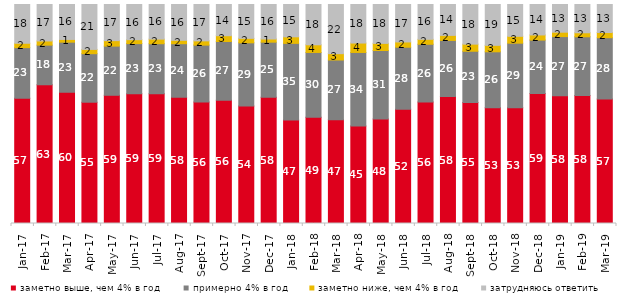
| Category | заметно выше, чем 4% в год | примерно 4% в год | заметно ниже, чем 4% в год | затрудняюсь ответить |
|---|---|---|---|---|
| 2017-01-01 | 57.15 | 23.15 | 2 | 17.7 |
| 2017-02-01 | 63.35 | 18.1 | 1.9 | 16.65 |
| 2017-03-01 | 59.9 | 22.9 | 1.25 | 15.95 |
| 2017-04-01 | 55.35 | 22.15 | 1.95 | 20.5 |
| 2017-05-01 | 58.55 | 22.45 | 2.5 | 16.5 |
| 2017-06-01 | 59.25 | 22.85 | 1.8 | 16.05 |
| 2017-07-01 | 59.2 | 22.85 | 2.1 | 15.8 |
| 2017-08-01 | 57.7 | 24.4 | 1.55 | 16.35 |
| 2017-09-01 | 55.5 | 25.95 | 1.95 | 16.6 |
| 2017-10-01 | 56.3 | 26.8 | 2.65 | 14.25 |
| 2017-11-01 | 53.6 | 28.9 | 2.05 | 15.45 |
| 2017-12-01 | 57.65 | 25.15 | 1.45 | 15.75 |
| 2018-01-01 | 47.25 | 35 | 3 | 14.75 |
| 2018-02-01 | 48.5 | 29.6 | 3.5 | 18.4 |
| 2018-03-01 | 47.4 | 27.25 | 2.9 | 22.45 |
| 2018-04-01 | 44.55 | 33.55 | 4.3 | 17.6 |
| 2018-05-01 | 47.7 | 31.3 | 3.25 | 17.75 |
| 2018-06-01 | 52.2 | 28.3 | 2.4 | 17.1 |
| 2018-07-01 | 55.5 | 26.35 | 2.25 | 15.9 |
| 2018-08-01 | 57.95 | 25.65 | 2.3 | 14.1 |
| 2018-09-01 | 55.3 | 23.35 | 3.25 | 18.1 |
| 2018-10-01 | 52.85 | 25.55 | 2.95 | 18.65 |
| 2018-11-01 | 52.844 | 29.491 | 3.144 | 14.521 |
| 2018-12-01 | 59.4 | 24.35 | 2.35 | 13.9 |
| 2019-01-01 | 58.3 | 27.05 | 2 | 12.65 |
| 2019-02-01 | 58.45 | 26.8 | 1.85 | 12.9 |
| 2019-03-01 | 56.887 | 27.946 | 2.387 | 12.78 |